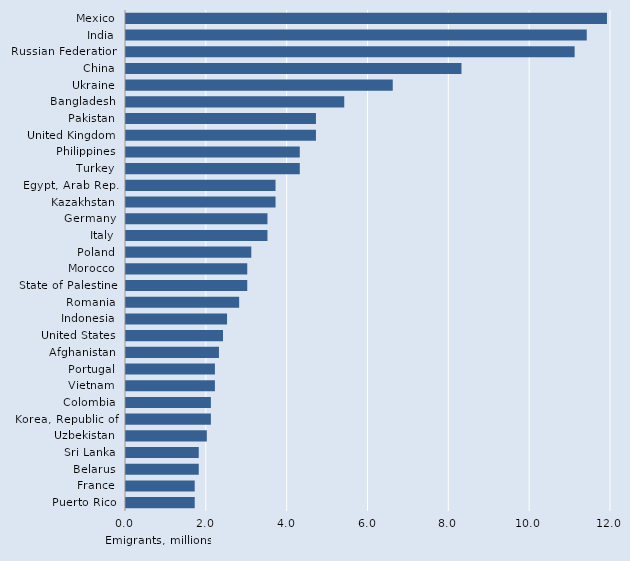
| Category | Series 0 |
|---|---|
| Mexico | 11.9 |
| India | 11.4 |
| Russian Federation | 11.1 |
| China | 8.3 |
| Ukraine | 6.6 |
| Bangladesh | 5.4 |
| Pakistan | 4.7 |
| United Kingdom | 4.7 |
| Philippines | 4.3 |
| Turkey | 4.3 |
| Egypt, Arab Rep. | 3.7 |
| Kazakhstan | 3.7 |
| Germany | 3.5 |
| Italy | 3.5 |
| Poland | 3.1 |
| Morocco | 3 |
| State of Palestine | 3 |
| Romania | 2.8 |
| Indonesia | 2.5 |
| United States | 2.4 |
| Afghanistan | 2.3 |
| Portugal | 2.2 |
| Vietnam | 2.2 |
| Colombia | 2.1 |
| Korea, Republic of | 2.1 |
| Uzbekistan | 2 |
| Sri Lanka | 1.8 |
| Belarus | 1.8 |
| France | 1.7 |
| Puerto Rico | 1.7 |